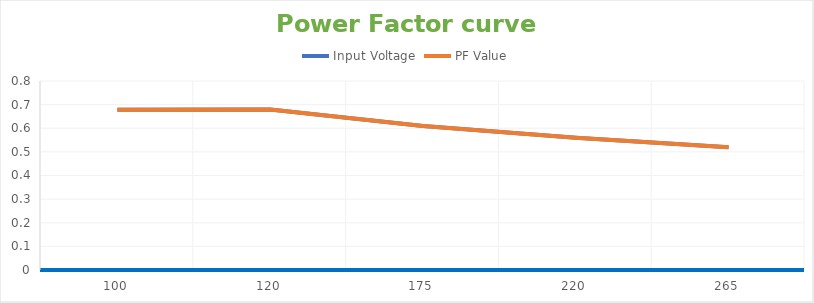
| Category | Input Voltage | PF Value |
|---|---|---|
| 100.0 | 0.678 | 0.678 |
| 120.0 | 0.679 | 0.679 |
| 175.0 | 0.61 | 0.61 |
| 220.0 | 0.56 | 0.56 |
| 265.0 | 0.52 | 0.52 |